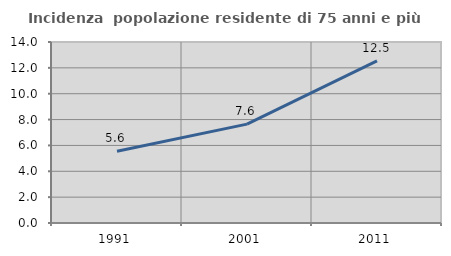
| Category | Incidenza  popolazione residente di 75 anni e più |
|---|---|
| 1991.0 | 5.556 |
| 2001.0 | 7.649 |
| 2011.0 | 12.544 |